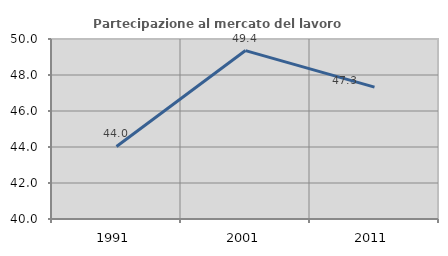
| Category | Partecipazione al mercato del lavoro  femminile |
|---|---|
| 1991.0 | 44.031 |
| 2001.0 | 49.357 |
| 2011.0 | 47.326 |